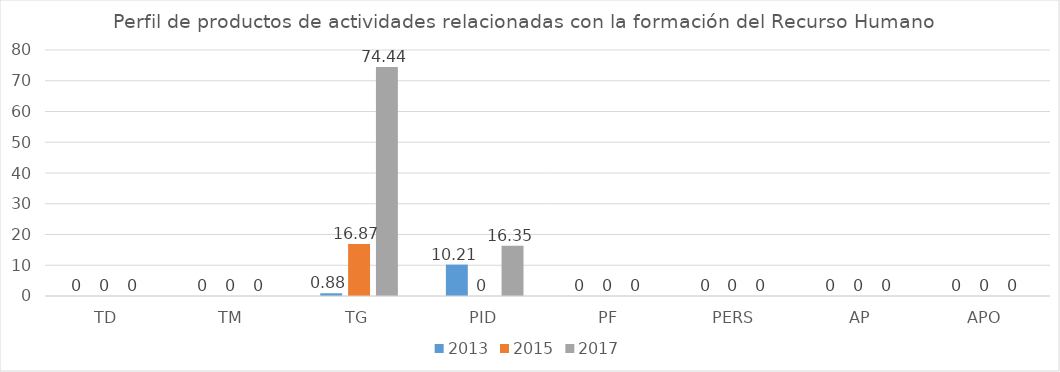
| Category | 2013 | 2015 | 2017 |
|---|---|---|---|
| TD | 0 | 0 | 0 |
| TM | 0 | 0 | 0 |
| TG | 0.88 | 16.87 | 74.44 |
| PID | 10.21 | 0 | 16.35 |
| PF | 0 | 0 | 0 |
| PERS | 0 | 0 | 0 |
| AP | 0 | 0 | 0 |
| APO | 0 | 0 | 0 |